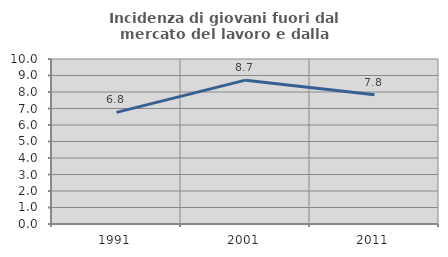
| Category | Incidenza di giovani fuori dal mercato del lavoro e dalla formazione  |
|---|---|
| 1991.0 | 6.765 |
| 2001.0 | 8.718 |
| 2011.0 | 7.831 |